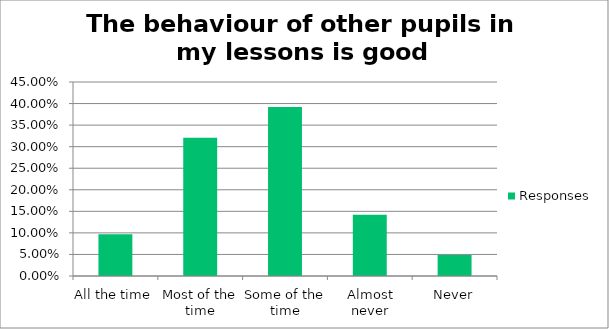
| Category | Responses |
|---|---|
| All the time | 0.097 |
| Most of the time | 0.321 |
| Some of the time | 0.392 |
| Almost never | 0.142 |
| Never | 0.048 |